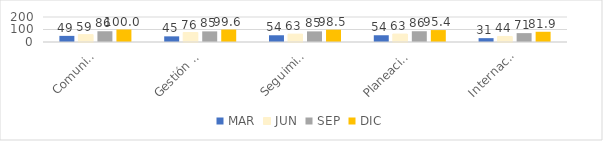
| Category | MAR | JUN | SEP | DIC |
|---|---|---|---|---|
| Comunicación | 49 | 59 | 86 | 100 |
| Gestión de la Calidad | 45.2 | 76 | 85 | 99.6 |
| Seguimiento y Control | 53.9 | 63 | 85 | 98.5 |
| Planeación Institucional | 54 | 63.3 | 86 | 95.4 |
| Internacionalización | 30.8 | 44.1 | 71 | 81.9 |